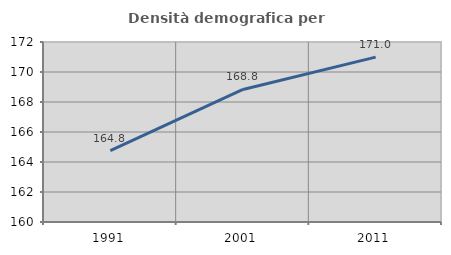
| Category | Densità demografica |
|---|---|
| 1991.0 | 164.757 |
| 2001.0 | 168.835 |
| 2011.0 | 170.99 |